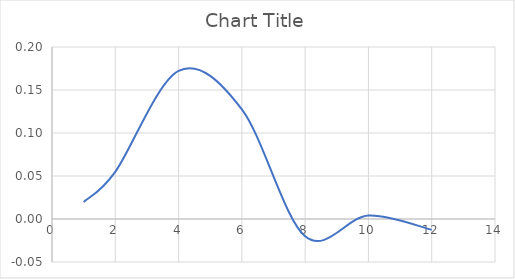
| Category | Series 0 |
|---|---|
| 1.0 | 0.02 |
| 2.0 | 0.055 |
| 4.0 | 0.172 |
| 6.0 | 0.128 |
| 8.0 | -0.02 |
| 10.0 | 0.004 |
| 12.0 | -0.013 |